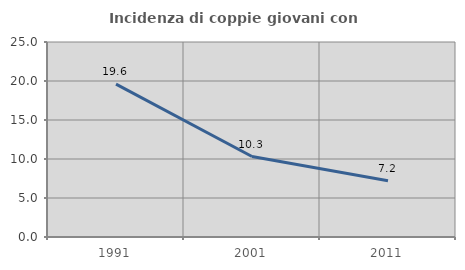
| Category | Incidenza di coppie giovani con figli |
|---|---|
| 1991.0 | 19.599 |
| 2001.0 | 10.314 |
| 2011.0 | 7.225 |